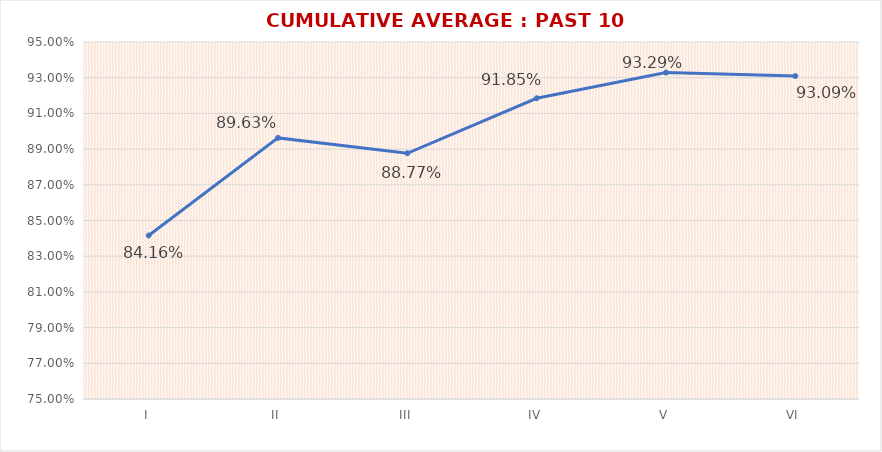
| Category | CUMULATIVE AVERAGE : PAST 10 YEARS |
|---|---|
| I | 0.842 |
| II | 0.896 |
| III | 0.888 |
| IV | 0.918 |
| V | 0.933 |
| VI | 0.931 |